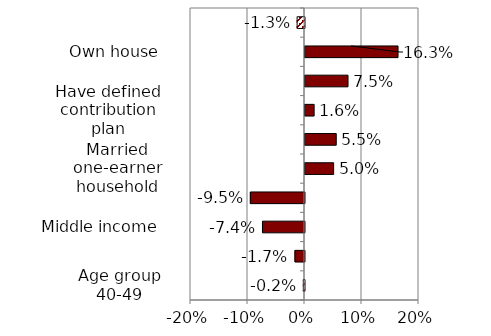
| Category | Series 0 |
|---|---|
| Age group 40-49 | -0.002 |
| Age group 50-59 | -0.017 |
| Middle income | -0.074 |
| High income | -0.095 |
| Married one-earner household | 0.05 |
| College degree | 0.055 |
| Have defined contribution plan | 0.016 |
| Have defined benefit plan | 0.075 |
| Own house | 0.163 |
| Risk averse | -0.013 |